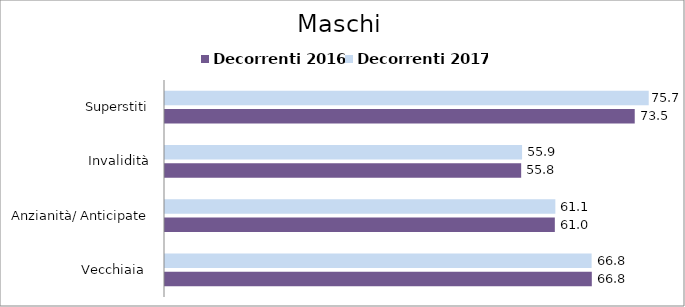
| Category | Decorrenti 2016 | Decorrenti 2017 |
|---|---|---|
| Vecchiaia  | 66.82 | 66.79 |
| Anzianità/ Anticipate | 61.03 | 61.11 |
| Invalidità | 55.76 | 55.9 |
| Superstiti | 73.54 | 75.73 |